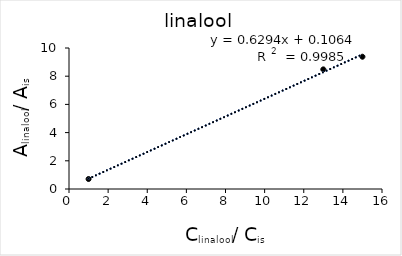
| Category | Series 0 |
|---|---|
| 1.0 | 0.708 |
| 13.0 | 8.485 |
| 15.0 | 9.381 |